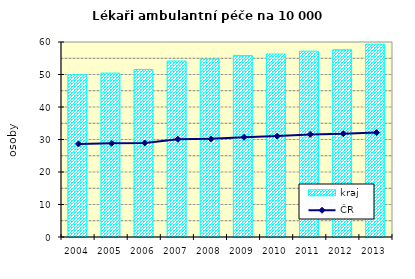
| Category | kraj |
|---|---|
| 2004.0 | 49.893 |
| 2005.0 | 50.43 |
| 2006.0 | 51.525 |
| 2007.0 | 54.141 |
| 2008.0 | 54.728 |
| 2009.0 | 55.861 |
| 2010.0 | 56.302 |
| 2011.0 | 57.175 |
| 2012.0 | 57.62 |
| 2013.0 | 59.33 |